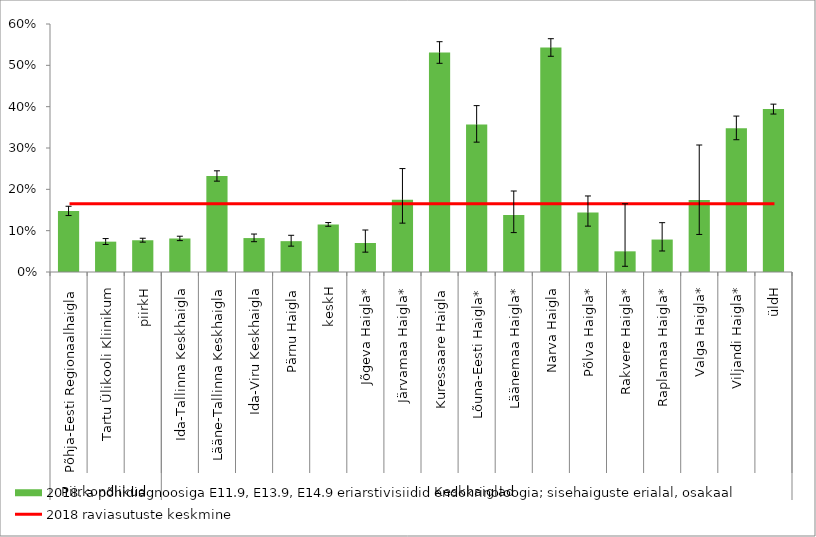
| Category | 2018. a põhidiagnoosiga E11.9, E13.9, E14.9 eriarstivisiidid endokrinoloogia; sisehaiguste erialal, osakaal |
|---|---|
| 0 | 0.147 |
| 1 | 0.073 |
| 2 | 0.077 |
| 3 | 0.081 |
| 4 | 0.232 |
| 5 | 0.082 |
| 6 | 0.075 |
| 7 | 0.115 |
| 8 | 0.07 |
| 9 | 0.175 |
| 10 | 0.531 |
| 11 | 0.357 |
| 12 | 0.138 |
| 13 | 0.543 |
| 14 | 0.144 |
| 15 | 0.05 |
| 16 | 0.079 |
| 17 | 0.174 |
| 18 | 0.348 |
| 19 | 0.394 |